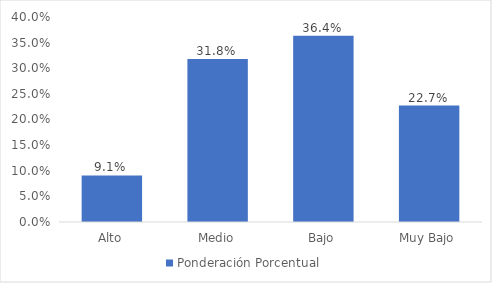
| Category | Ponderación Porcentual |
|---|---|
| Alto | 0.091 |
| Medio | 0.318 |
| Bajo | 0.364 |
| Muy Bajo | 0.227 |